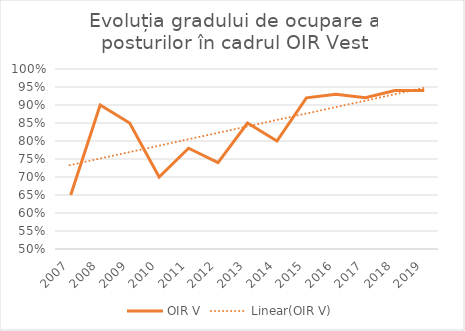
| Category | OIR V |
|---|---|
| 2007.0 | 0.65 |
| 2008.0 | 0.9 |
| 2009.0 | 0.85 |
| 2010.0 | 0.7 |
| 2011.0 | 0.78 |
| 2012.0 | 0.74 |
| 2013.0 | 0.85 |
| 2014.0 | 0.8 |
| 2015.0 | 0.92 |
| 2016.0 | 0.93 |
| 2017.0 | 0.92 |
| 2018.0 | 0.94 |
| 2019.0 | 0.94 |